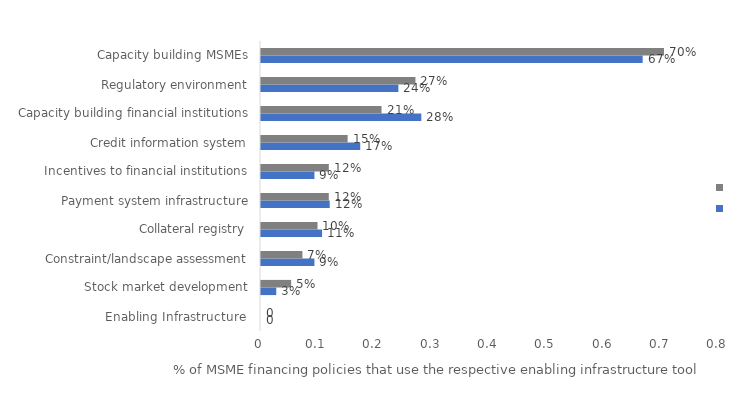
| Category | Series 0 | Series 1 |
|---|---|---|
| Enabling Infrastructure  | 0 | 0 |
| Stock market development | 0.027 | 0.053 |
| Constraint/landscape assessment | 0.093 | 0.072 |
| Collateral registry | 0.107 | 0.099 |
| Payment system infrastructure | 0.12 | 0.118 |
| Incentives to financial institutions | 0.093 | 0.118 |
| Credit information system | 0.173 | 0.151 |
| Capacity building financial institutions | 0.28 | 0.211 |
| Regulatory environment | 0.24 | 0.27 |
| Capacity building MSMEs | 0.667 | 0.704 |